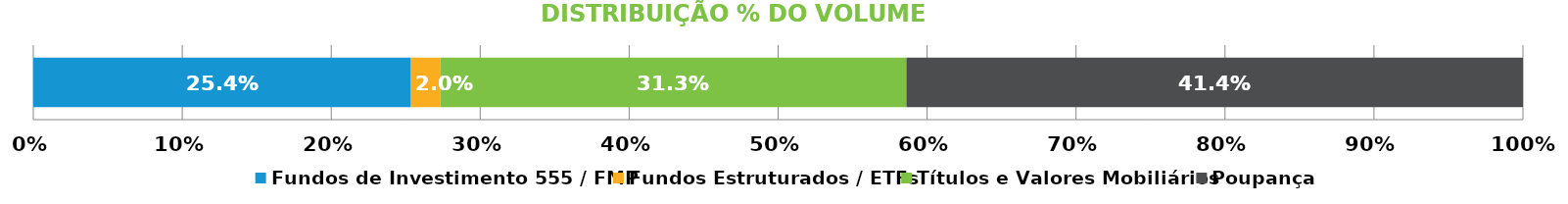
| Category | Fundos de Investimento 555 / FMP | Fundos Estruturados / ETFs | Títulos e Valores Mobiliários | Poupança |
|---|---|---|---|---|
| 0 | 0.254 | 0.02 | 0.313 | 0.414 |